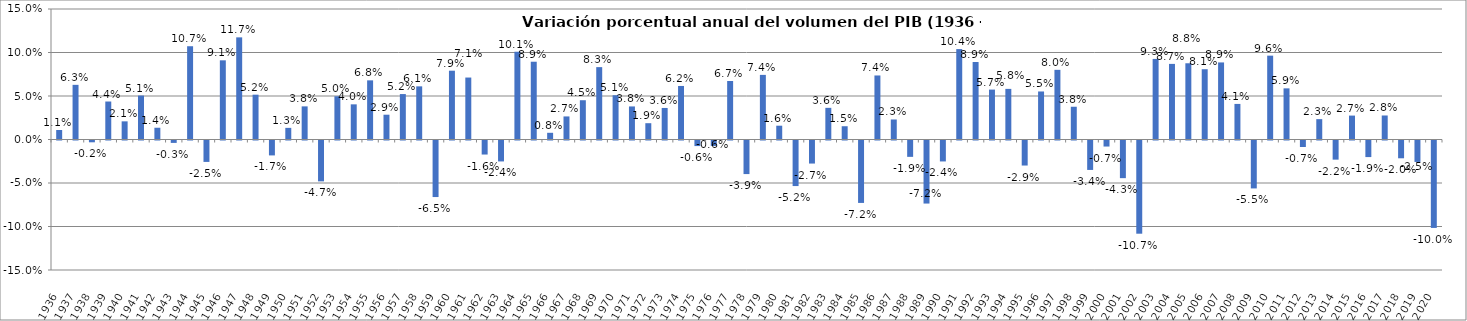
| Category | Variación porcentual anual  |
|---|---|
| 1936.0 | 0.011 |
| 1937.0 | 0.063 |
| 1938.0 | -0.002 |
| 1939.0 | 0.044 |
| 1940.0 | 0.021 |
| 1941.0 | 0.051 |
| 1942.0 | 0.014 |
| 1943.0 | -0.003 |
| 1944.0 | 0.107 |
| 1945.0 | -0.025 |
| 1946.0 | 0.091 |
| 1947.0 | 0.117 |
| 1948.0 | 0.052 |
| 1949.0 | -0.017 |
| 1950.0 | 0.013 |
| 1951.0 | 0.038 |
| 1952.0 | -0.047 |
| 1953.0 | 0.05 |
| 1954.0 | 0.04 |
| 1955.0 | 0.068 |
| 1956.0 | 0.029 |
| 1957.0 | 0.052 |
| 1958.0 | 0.061 |
| 1959.0 | -0.065 |
| 1960.0 | 0.079 |
| 1961.0 | 0.071 |
| 1962.0 | -0.016 |
| 1963.0 | -0.024 |
| 1964.0 | 0.101 |
| 1965.0 | 0.089 |
| 1966.0 | 0.008 |
| 1967.0 | 0.027 |
| 1968.0 | 0.045 |
| 1969.0 | 0.083 |
| 1970.0 | 0.051 |
| 1971.0 | 0.038 |
| 1972.0 | 0.019 |
| 1973.0 | 0.036 |
| 1974.0 | 0.062 |
| 1975.0 | -0.006 |
| 1976.0 | -0.006 |
| 1977.0 | 0.067 |
| 1978.0 | -0.039 |
| 1979.0 | 0.074 |
| 1980.0 | 0.016 |
| 1981.0 | -0.052 |
| 1982.0 | -0.027 |
| 1983.0 | 0.036 |
| 1984.0 | 0.015 |
| 1985.0 | -0.072 |
| 1986.0 | 0.074 |
| 1987.0 | 0.023 |
| 1988.0 | -0.019 |
| 1989.0 | -0.072 |
| 1990.0 | -0.024 |
| 1991.0 | 0.104 |
| 1992.0 | 0.089 |
| 1993.0 | 0.057 |
| 1994.0 | 0.058 |
| 1995.0 | -0.029 |
| 1996.0 | 0.055 |
| 1997.0 | 0.08 |
| 1998.0 | 0.038 |
| 1999.0 | -0.034 |
| 2000.0 | -0.007 |
| 2001.0 | -0.043 |
| 2002.0 | -0.107 |
| 2003.0 | 0.093 |
| 2004.0 | 0.087 |
| 2005.0 | 0.088 |
| 2006.0 | 0.081 |
| 2007.0 | 0.089 |
| 2008.0 | 0.041 |
| 2009.0 | -0.055 |
| 2010.0 | 0.096 |
| 2011.0 | 0.059 |
| 2012.0 | -0.007 |
| 2013.0 | 0.023 |
| 2014.0 | -0.022 |
| 2015.0 | 0.027 |
| 2016.0 | -0.019 |
| 2017.0 | 0.028 |
| 2018.0 | -0.02 |
| 2019.0 | -0.025 |
| 2020.0 | -0.1 |